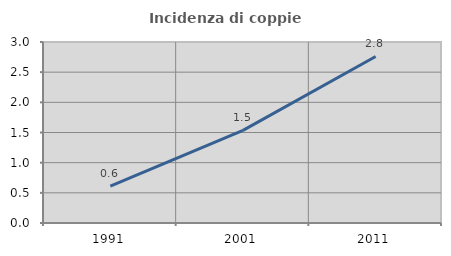
| Category | Incidenza di coppie miste |
|---|---|
| 1991.0 | 0.611 |
| 2001.0 | 1.534 |
| 2011.0 | 2.761 |